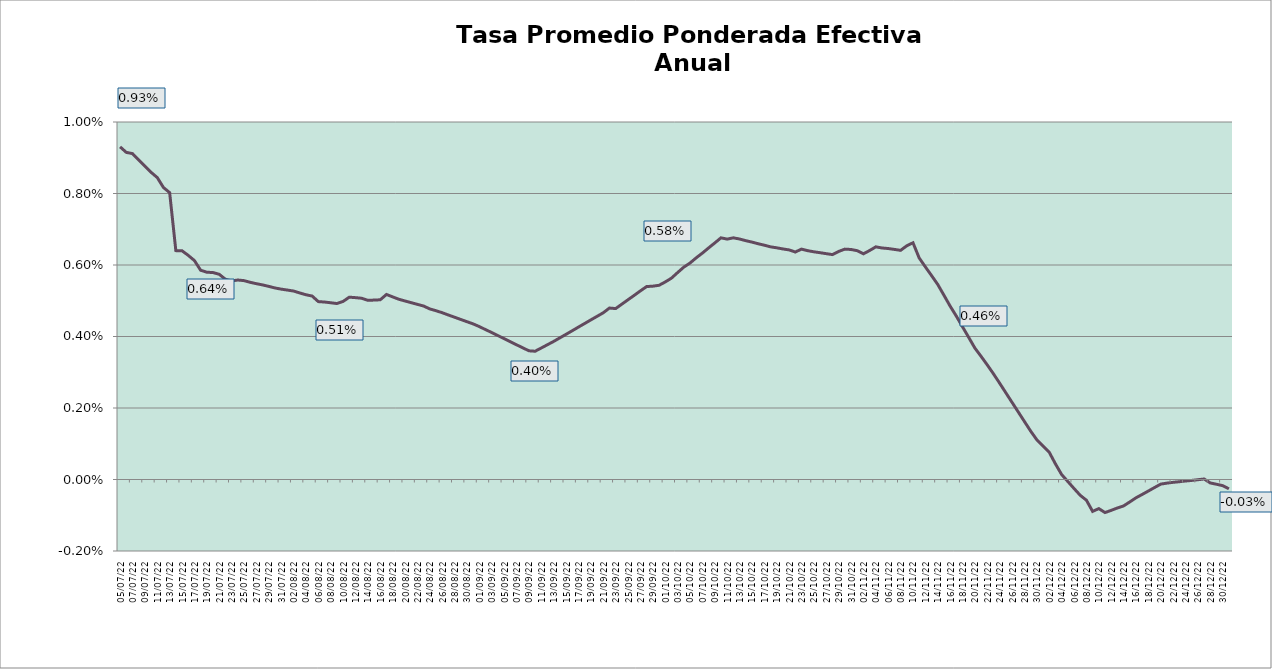
| Category | Tasa Efectiva Anual |
|---|---|
| 2022-07-05 | 0.009 |
| 2022-07-06 | 0.009 |
| 2022-07-07 | 0.009 |
| 2022-07-08 | 0.009 |
| 2022-07-09 | 0.009 |
| 2022-07-10 | 0.009 |
| 2022-07-11 | 0.008 |
| 2022-07-12 | 0.008 |
| 2022-07-13 | 0.008 |
| 2022-07-14 | 0.006 |
| 2022-07-15 | 0.006 |
| 2022-07-16 | 0.006 |
| 2022-07-17 | 0.006 |
| 2022-07-18 | 0.006 |
| 2022-07-19 | 0.006 |
| 2022-07-20 | 0.006 |
| 2022-07-21 | 0.006 |
| 2022-07-22 | 0.006 |
| 2022-07-23 | 0.006 |
| 2022-07-24 | 0.006 |
| 2022-07-25 | 0.006 |
| 2022-07-26 | 0.006 |
| 2022-07-27 | 0.005 |
| 2022-07-28 | 0.005 |
| 2022-07-29 | 0.005 |
| 2022-07-30 | 0.005 |
| 2022-07-31 | 0.005 |
| 2022-08-01 | 0.005 |
| 2022-08-02 | 0.005 |
| 2022-08-03 | 0.005 |
| 2022-08-04 | 0.005 |
| 2022-08-05 | 0.005 |
| 2022-08-06 | 0.005 |
| 2022-08-07 | 0.005 |
| 2022-08-08 | 0.005 |
| 2022-08-09 | 0.005 |
| 2022-08-10 | 0.005 |
| 2022-08-11 | 0.005 |
| 2022-08-12 | 0.005 |
| 2022-08-13 | 0.005 |
| 2022-08-14 | 0.005 |
| 2022-08-15 | 0.005 |
| 2022-08-16 | 0.005 |
| 2022-08-17 | 0.005 |
| 2022-08-18 | 0.005 |
| 2022-08-19 | 0.005 |
| 2022-08-20 | 0.005 |
| 2022-08-21 | 0.005 |
| 2022-08-22 | 0.005 |
| 2022-08-23 | 0.005 |
| 2022-08-24 | 0.005 |
| 2022-08-25 | 0.005 |
| 2022-08-26 | 0.005 |
| 2022-08-27 | 0.005 |
| 2022-08-28 | 0.005 |
| 2022-08-29 | 0.004 |
| 2022-08-30 | 0.004 |
| 2022-08-31 | 0.004 |
| 2022-09-01 | 0.004 |
| 2022-09-02 | 0.004 |
| 2022-09-03 | 0.004 |
| 2022-09-04 | 0.004 |
| 2022-09-05 | 0.004 |
| 2022-09-06 | 0.004 |
| 2022-09-07 | 0.004 |
| 2022-09-08 | 0.004 |
| 2022-09-09 | 0.004 |
| 2022-09-10 | 0.004 |
| 2022-09-11 | 0.004 |
| 2022-09-12 | 0.004 |
| 2022-09-13 | 0.004 |
| 2022-09-14 | 0.004 |
| 2022-09-15 | 0.004 |
| 2022-09-16 | 0.004 |
| 2022-09-17 | 0.004 |
| 2022-09-18 | 0.004 |
| 2022-09-19 | 0.004 |
| 2022-09-20 | 0.005 |
| 2022-09-21 | 0.005 |
| 2022-09-22 | 0.005 |
| 2022-09-23 | 0.005 |
| 2022-09-24 | 0.005 |
| 2022-09-25 | 0.005 |
| 2022-09-26 | 0.005 |
| 2022-09-27 | 0.005 |
| 2022-09-28 | 0.005 |
| 2022-09-29 | 0.005 |
| 2022-09-30 | 0.005 |
| 2022-10-01 | 0.006 |
| 2022-10-02 | 0.006 |
| 2022-10-03 | 0.006 |
| 2022-10-04 | 0.006 |
| 2022-10-05 | 0.006 |
| 2022-10-06 | 0.006 |
| 2022-10-07 | 0.006 |
| 2022-10-08 | 0.006 |
| 2022-10-09 | 0.007 |
| 2022-10-10 | 0.007 |
| 2022-10-11 | 0.007 |
| 2022-10-12 | 0.007 |
| 2022-10-13 | 0.007 |
| 2022-10-14 | 0.007 |
| 2022-10-15 | 0.007 |
| 2022-10-16 | 0.007 |
| 2022-10-17 | 0.007 |
| 2022-10-18 | 0.007 |
| 2022-10-19 | 0.006 |
| 2022-10-20 | 0.006 |
| 2022-10-21 | 0.006 |
| 2022-10-22 | 0.006 |
| 2022-10-23 | 0.006 |
| 2022-10-24 | 0.006 |
| 2022-10-25 | 0.006 |
| 2022-10-26 | 0.006 |
| 2022-10-27 | 0.006 |
| 2022-10-28 | 0.006 |
| 2022-10-29 | 0.006 |
| 2022-10-30 | 0.006 |
| 2022-10-31 | 0.006 |
| 2022-11-01 | 0.006 |
| 2022-11-02 | 0.006 |
| 2022-11-03 | 0.006 |
| 2022-11-04 | 0.007 |
| 2022-11-05 | 0.006 |
| 2022-11-06 | 0.006 |
| 2022-11-07 | 0.006 |
| 2022-11-08 | 0.006 |
| 2022-11-09 | 0.007 |
| 2022-11-10 | 0.007 |
| 2022-11-11 | 0.006 |
| 2022-11-12 | 0.006 |
| 2022-11-13 | 0.006 |
| 2022-11-14 | 0.005 |
| 2022-11-15 | 0.005 |
| 2022-11-16 | 0.005 |
| 2022-11-17 | 0.005 |
| 2022-11-18 | 0.004 |
| 2022-11-19 | 0.004 |
| 2022-11-20 | 0.004 |
| 2022-11-21 | 0.003 |
| 2022-11-22 | 0.003 |
| 2022-11-23 | 0.003 |
| 2022-11-24 | 0.003 |
| 2022-11-25 | 0.002 |
| 2022-11-26 | 0.002 |
| 2022-11-27 | 0.002 |
| 2022-11-28 | 0.002 |
| 2022-11-29 | 0.001 |
| 2022-11-30 | 0.001 |
| 2022-12-01 | 0.001 |
| 2022-12-02 | 0.001 |
| 2022-12-03 | 0 |
| 2022-12-04 | 0 |
| 2022-12-05 | 0 |
| 2022-12-06 | 0 |
| 2022-12-07 | 0 |
| 2022-12-08 | -0.001 |
| 2022-12-09 | -0.001 |
| 2022-12-10 | -0.001 |
| 2022-12-11 | -0.001 |
| 2022-12-12 | -0.001 |
| 2022-12-13 | -0.001 |
| 2022-12-14 | -0.001 |
| 2022-12-15 | -0.001 |
| 2022-12-16 | -0.001 |
| 2022-12-17 | 0 |
| 2022-12-18 | 0 |
| 2022-12-19 | 0 |
| 2022-12-20 | 0 |
| 2022-12-21 | 0 |
| 2022-12-22 | 0 |
| 2022-12-23 | 0 |
| 2022-12-24 | 0 |
| 2022-12-25 | 0 |
| 2022-12-26 | 0 |
| 2022-12-27 | 0 |
| 2022-12-28 | 0 |
| 2022-12-29 | 0 |
| 2022-12-30 | 0 |
| 2022-12-31 | 0 |